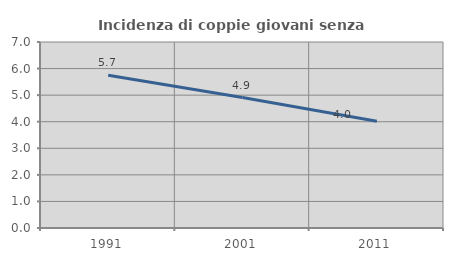
| Category | Incidenza di coppie giovani senza figli |
|---|---|
| 1991.0 | 5.747 |
| 2001.0 | 4.91 |
| 2011.0 | 4.019 |